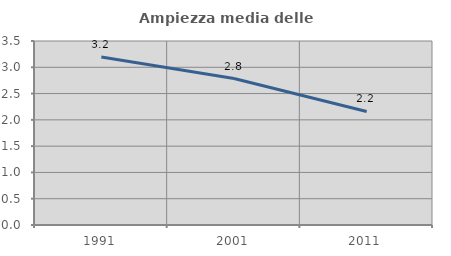
| Category | Ampiezza media delle famiglie |
|---|---|
| 1991.0 | 3.197 |
| 2001.0 | 2.787 |
| 2011.0 | 2.16 |